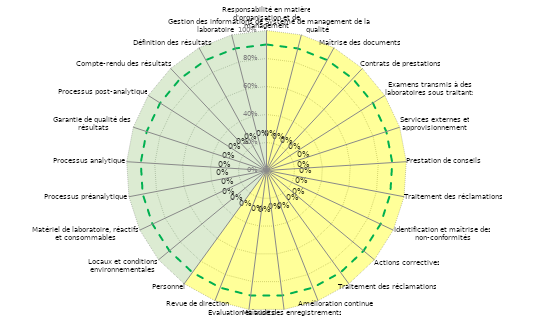
| Category | Couleur Art 4 | Couleur Art 5 | Seuil conformité | Résultats |
|---|---|---|---|---|
| 0 | 1 | 1 | 0.9 | 0 |
| 1 | 1 | 0 | 0.9 | 0 |
| 2 | 1 | 0 | 0.9 | 0 |
| 3 | 1 | 0 | 0.9 | 0 |
| 4 | 1 | 0 | 0.9 | 0 |
| 5 | 1 | 0 | 0.9 | 0 |
| 6 | 1 | 0 | 0.9 | 0 |
| 7 | 1 | 0 | 0.9 | 0 |
| 8 | 1 | 0 | 0.9 | 0 |
| 9 | 1 | 0 | 0.9 | 0 |
| 10 | 1 | 0 | 0.9 | 0 |
| 11 | 1 | 0 | 0.9 | 0 |
| 12 | 1 | 0 | 0.9 | 0 |
| 13 | 1 | 0 | 0.9 | 0 |
| 14 | 1 | 0 | 0.9 | 0 |
| 15 | 1 | 1 | 0.9 | 0 |
| 16 | 0 | 1 | 0.9 | 0 |
| 17 | 0 | 1 | 0.9 | 0 |
| 18 | 0 | 1 | 0.9 | 0 |
| 19 | 0 | 1 | 0.9 | 0 |
| 20 | 0 | 1 | 0.9 | 0 |
| 21 | 0 | 1 | 0.9 | 0 |
| 22 | 0 | 1 | 0.9 | 0 |
| 23 | 0 | 1 | 0.9 | 0 |
| 24 | 0 | 1 | 0.9 | 0 |